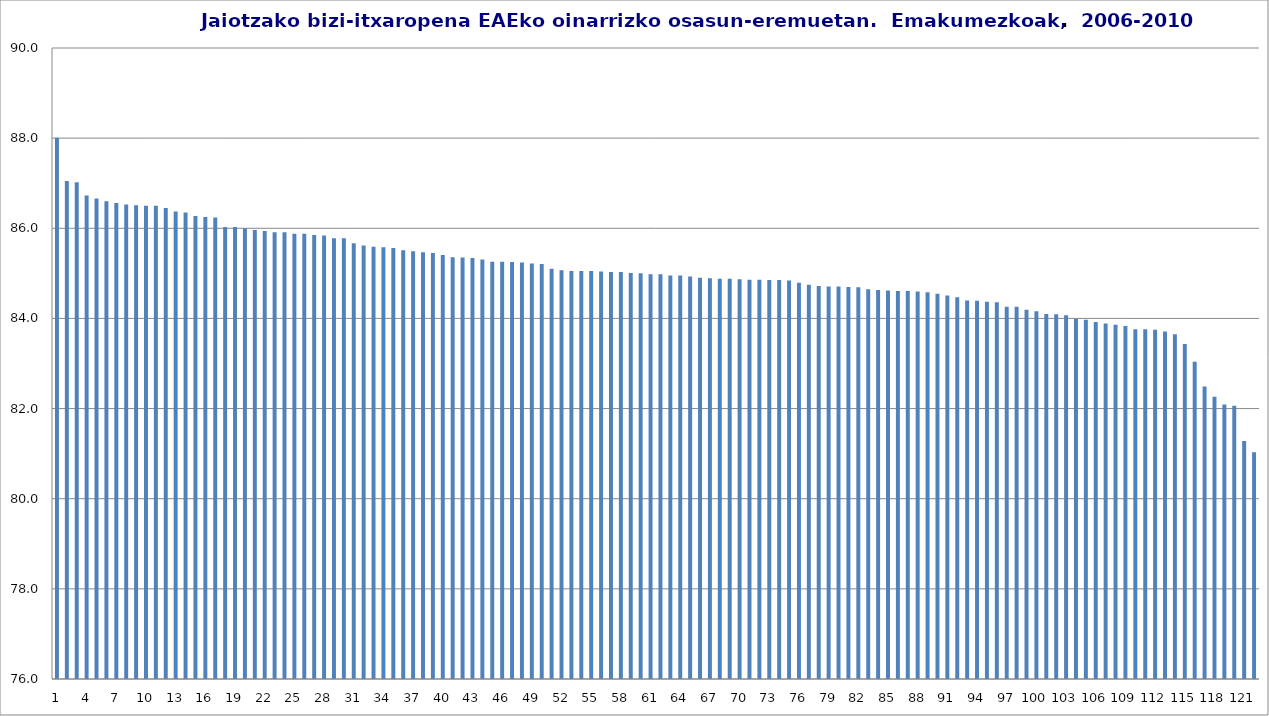
| Category | Series 0 |
|---|---|
| 0 | 88.01 |
| 1 | 87.05 |
| 2 | 87.02 |
| 3 | 86.73 |
| 4 | 86.66 |
| 5 | 86.6 |
| 6 | 86.56 |
| 7 | 86.53 |
| 8 | 86.51 |
| 9 | 86.5 |
| 10 | 86.5 |
| 11 | 86.45 |
| 12 | 86.37 |
| 13 | 86.35 |
| 14 | 86.27 |
| 15 | 86.25 |
| 16 | 86.24 |
| 17 | 86.03 |
| 18 | 86.03 |
| 19 | 86 |
| 20 | 85.96 |
| 21 | 85.94 |
| 22 | 85.91 |
| 23 | 85.91 |
| 24 | 85.88 |
| 25 | 85.88 |
| 26 | 85.85 |
| 27 | 85.84 |
| 28 | 85.78 |
| 29 | 85.78 |
| 30 | 85.67 |
| 31 | 85.62 |
| 32 | 85.59 |
| 33 | 85.58 |
| 34 | 85.56 |
| 35 | 85.51 |
| 36 | 85.49 |
| 37 | 85.47 |
| 38 | 85.45 |
| 39 | 85.41 |
| 40 | 85.36 |
| 41 | 85.35 |
| 42 | 85.34 |
| 43 | 85.31 |
| 44 | 85.26 |
| 45 | 85.26 |
| 46 | 85.25 |
| 47 | 85.24 |
| 48 | 85.22 |
| 49 | 85.21 |
| 50 | 85.1 |
| 51 | 85.07 |
| 52 | 85.05 |
| 53 | 85.05 |
| 54 | 85.05 |
| 55 | 85.04 |
| 56 | 85.03 |
| 57 | 85.03 |
| 58 | 85.01 |
| 59 | 85 |
| 60 | 84.98 |
| 61 | 84.98 |
| 62 | 84.95 |
| 63 | 84.95 |
| 64 | 84.93 |
| 65 | 84.9 |
| 66 | 84.89 |
| 67 | 84.88 |
| 68 | 84.88 |
| 69 | 84.87 |
| 70 | 84.86 |
| 71 | 84.86 |
| 72 | 84.85 |
| 73 | 84.85 |
| 74 | 84.84 |
| 75 | 84.79 |
| 76 | 84.75 |
| 77 | 84.72 |
| 78 | 84.71 |
| 79 | 84.71 |
| 80 | 84.7 |
| 81 | 84.69 |
| 82 | 84.65 |
| 83 | 84.63 |
| 84 | 84.62 |
| 85 | 84.61 |
| 86 | 84.61 |
| 87 | 84.6 |
| 88 | 84.58 |
| 89 | 84.55 |
| 90 | 84.51 |
| 91 | 84.47 |
| 92 | 84.4 |
| 93 | 84.39 |
| 94 | 84.37 |
| 95 | 84.36 |
| 96 | 84.26 |
| 97 | 84.26 |
| 98 | 84.19 |
| 99 | 84.16 |
| 100 | 84.1 |
| 101 | 84.09 |
| 102 | 84.07 |
| 103 | 83.99 |
| 104 | 83.97 |
| 105 | 83.92 |
| 106 | 83.89 |
| 107 | 83.86 |
| 108 | 83.83 |
| 109 | 83.76 |
| 110 | 83.76 |
| 111 | 83.75 |
| 112 | 83.71 |
| 113 | 83.65 |
| 114 | 83.43 |
| 115 | 83.04 |
| 116 | 82.49 |
| 117 | 82.26 |
| 118 | 82.09 |
| 119 | 82.06 |
| 120 | 81.28 |
| 121 | 81.03 |